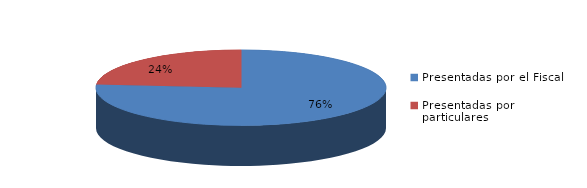
| Category | Series 0 |
|---|---|
| Presentadas por el Fiscal | 3265 |
| Presentadas por particulares | 1009 |